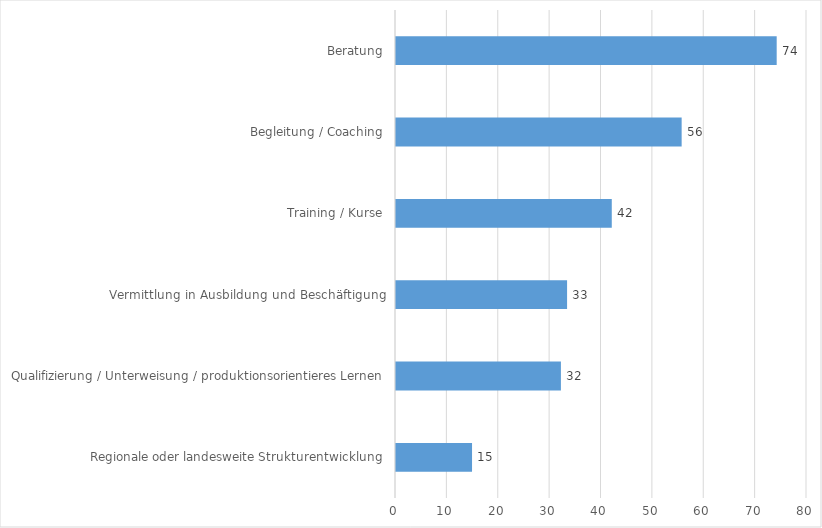
| Category | Series 0 |
|---|---|
| Regionale oder landesweite Strukturentwicklung | 14.8 |
| Qualifizierung / Unterweisung / produktionsorientieres Lernen | 32.1 |
| Vermittlung in Ausbildung und Beschäftigung | 33.3 |
| Training / Kurse | 42 |
| Begleitung / Coaching | 55.6 |
| Beratung | 74.1 |